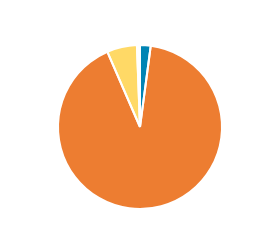
| Category | Series 0 |
|---|---|
| PC/MC | 709 |
| CAR/LGV | 30915 |
| OGV1 & PSV 2Axle | 2001 |
| OGV1 & PSV 3 Axle | 122 |
| OGV2 | 82 |